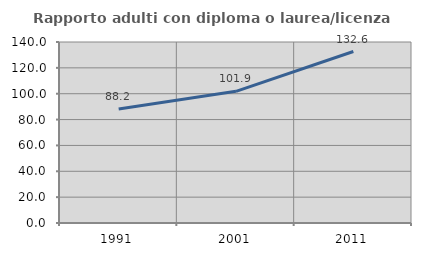
| Category | Rapporto adulti con diploma o laurea/licenza media  |
|---|---|
| 1991.0 | 88.183 |
| 2001.0 | 101.865 |
| 2011.0 | 132.633 |